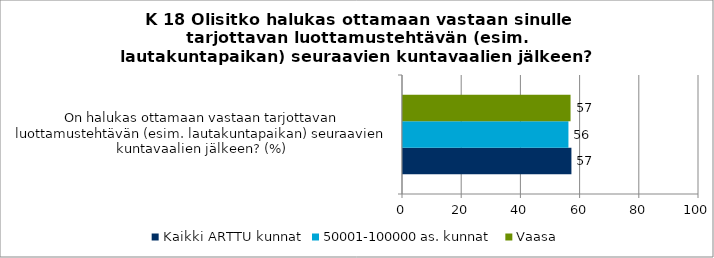
| Category | Kaikki ARTTU kunnat | 50001-100000 as. kunnat | Vaasa |
|---|---|---|---|
| On halukas ottamaan vastaan tarjottavan luottamustehtävän (esim. lautakuntapaikan) seuraavien kuntavaalien jälkeen? (%) | 56.9 | 55.892 | 56.604 |